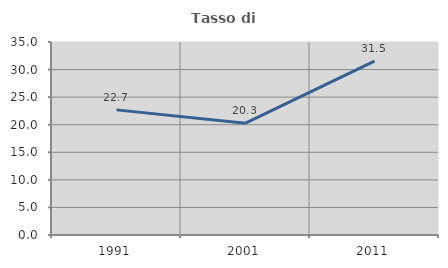
| Category | Tasso di occupazione   |
|---|---|
| 1991.0 | 22.692 |
| 2001.0 | 20.277 |
| 2011.0 | 31.535 |